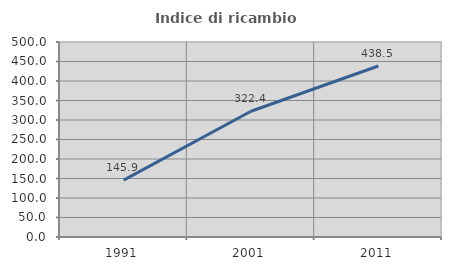
| Category | Indice di ricambio occupazionale  |
|---|---|
| 1991.0 | 145.882 |
| 2001.0 | 322.414 |
| 2011.0 | 438.462 |